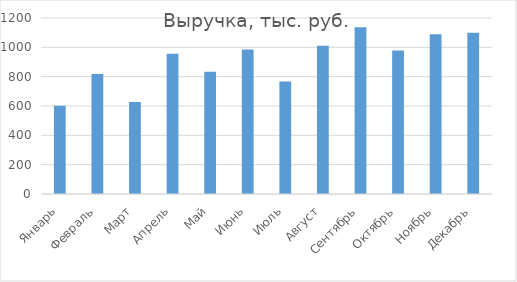
| Category | Выручка, тыс. руб. |
|---|---|
| Январь | 602 |
| Февраль | 818 |
| Март | 628 |
| Апрель | 956 |
| Май | 834 |
| Июнь | 986 |
| Июль | 767 |
| Август | 1011 |
| Сентябрь | 1137 |
| Октябрь | 978 |
| Ноябрь | 1089 |
| Декабрь | 1100 |